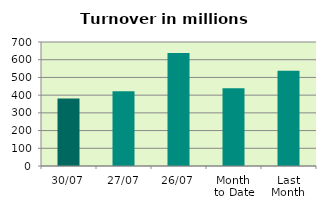
| Category | Series 0 |
|---|---|
| 30/07 | 381 |
| 27/07 | 422.029 |
| 26/07 | 638.509 |
| Month 
to Date | 438.422 |
| Last
Month | 537.964 |